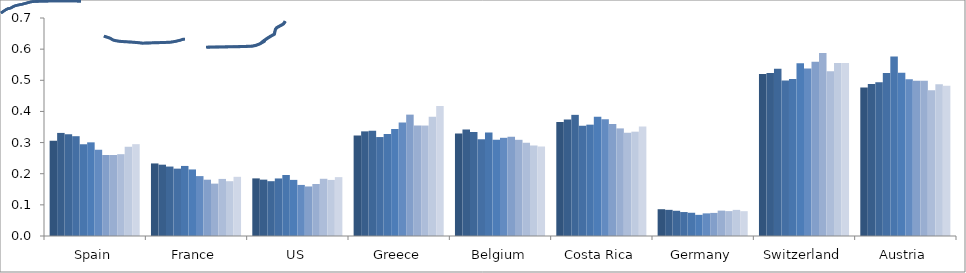
| Category | Series 0 | Series 1 | Series 2 | Series 3 | Series 4 | Series 5 | Series 6 | Series 7 | Series 8 | Series 9 | Series 10 | Series 11 |
|---|---|---|---|---|---|---|---|---|---|---|---|---|
| Spain | 0.306 | 0.331 | 0.327 | 0.32 | 0.295 | 0.301 | 0.277 | 0.26 | 0.26 | 0.263 | 0.286 | 0.295 |
| France | 0.233 | 0.229 | 0.223 | 0.216 | 0.225 | 0.214 | 0.192 | 0.181 | 0.168 | 0.183 | 0.176 | 0.19 |
| US | 0.185 | 0.181 | 0.176 | 0.185 | 0.196 | 0.18 | 0.164 | 0.159 | 0.167 | 0.184 | 0.18 | 0.189 |
| Greece | 0.323 | 0.336 | 0.338 | 0.318 | 0.327 | 0.344 | 0.364 | 0.39 | 0.355 | 0.355 | 0.383 | 0.417 |
| Belgium | 0.329 | 0.342 | 0.334 | 0.311 | 0.332 | 0.309 | 0.315 | 0.318 | 0.309 | 0.3 | 0.291 | 0.288 |
| Costa Rica | 0.366 | 0.374 | 0.389 | 0.354 | 0.358 | 0.383 | 0.375 | 0.36 | 0.346 | 0.332 | 0.335 | 0.352 |
| Germany | 0.086 | 0.084 | 0.081 | 0.077 | 0.075 | 0.068 | 0.073 | 0.074 | 0.082 | 0.08 | 0.084 | 0.08 |
| Switzerland | 0.52 | 0.523 | 0.537 | 0.499 | 0.504 | 0.555 | 0.538 | 0.56 | 0.588 | 0.529 | 0.555 | 0.555 |
| Austria | 0.477 | 0.488 | 0.494 | 0.524 | 0.576 | 0.524 | 0.503 | 0.498 | 0.498 | 0.468 | 0.487 | 0.482 |